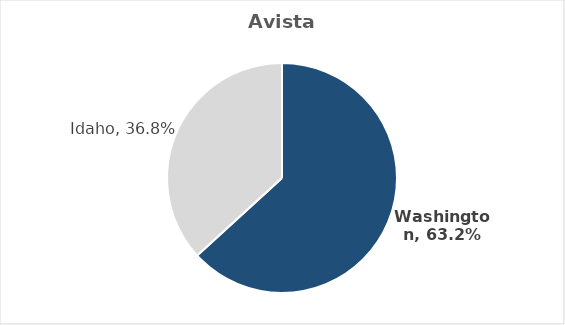
| Category | Series 0 |
|---|---|
| Washington | 0.632 |
| Idaho | 0.368 |